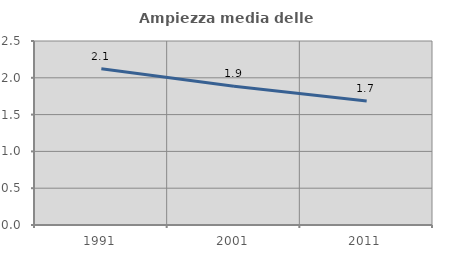
| Category | Ampiezza media delle famiglie |
|---|---|
| 1991.0 | 2.123 |
| 2001.0 | 1.886 |
| 2011.0 | 1.685 |